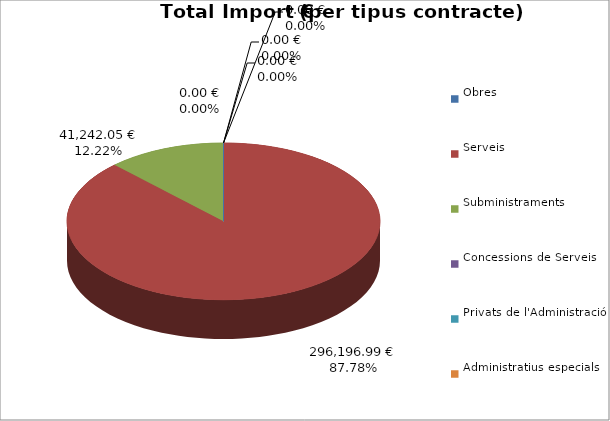
| Category | Total preu
(amb IVA) |
|---|---|
| Obres | 0 |
| Serveis | 296196.99 |
| Subministraments | 41242.05 |
| Concessions de Serveis | 0 |
| Privats de l'Administració | 0 |
| Administratius especials | 0 |